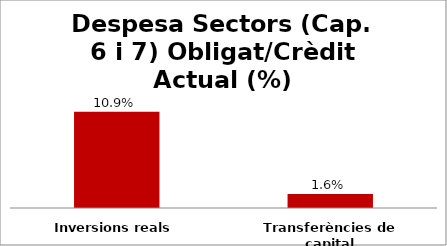
| Category | Series 0 |
|---|---|
| Inversions reals | 0.109 |
| Transferències de capital | 0.016 |